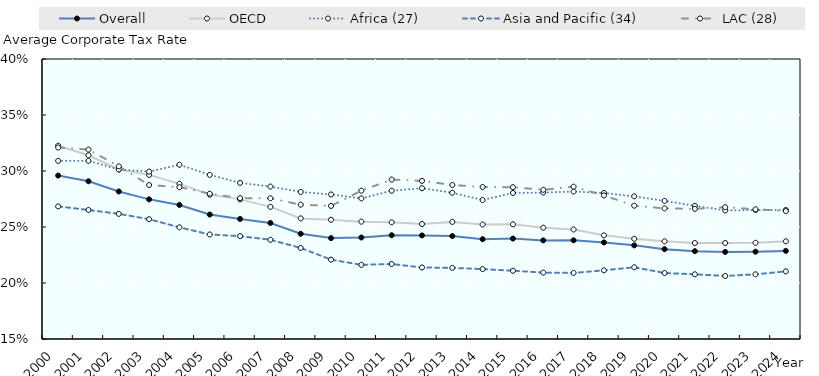
| Category | Overall | OECD | Africa (27) | Asia and Pacific (34) | LAC (28) |
|---|---|---|---|---|---|
| 2000.0 | 0.296 | 0.323 | 0.309 | 0.268 | 0.321 |
| 2001.0 | 0.291 | 0.314 | 0.309 | 0.265 | 0.319 |
| 2002.0 | 0.282 | 0.301 | 0.301 | 0.262 | 0.304 |
| 2003.0 | 0.275 | 0.297 | 0.299 | 0.257 | 0.287 |
| 2004.0 | 0.27 | 0.289 | 0.306 | 0.25 | 0.286 |
| 2005.0 | 0.261 | 0.279 | 0.297 | 0.243 | 0.28 |
| 2006.0 | 0.257 | 0.275 | 0.289 | 0.242 | 0.276 |
| 2007.0 | 0.254 | 0.268 | 0.286 | 0.239 | 0.276 |
| 2008.0 | 0.244 | 0.258 | 0.281 | 0.231 | 0.27 |
| 2009.0 | 0.24 | 0.256 | 0.279 | 0.221 | 0.269 |
| 2010.0 | 0.241 | 0.255 | 0.276 | 0.216 | 0.282 |
| 2011.0 | 0.243 | 0.254 | 0.282 | 0.217 | 0.292 |
| 2012.0 | 0.242 | 0.253 | 0.285 | 0.214 | 0.291 |
| 2013.0 | 0.242 | 0.255 | 0.281 | 0.214 | 0.288 |
| 2014.0 | 0.239 | 0.252 | 0.274 | 0.212 | 0.286 |
| 2015.0 | 0.24 | 0.252 | 0.28 | 0.211 | 0.286 |
| 2016.0 | 0.238 | 0.249 | 0.281 | 0.209 | 0.283 |
| 2017.0 | 0.238 | 0.248 | 0.282 | 0.209 | 0.286 |
| 2018.0 | 0.236 | 0.243 | 0.28 | 0.211 | 0.278 |
| 2019.0 | 0.234 | 0.239 | 0.277 | 0.214 | 0.269 |
| 2020.0 | 0.23 | 0.237 | 0.273 | 0.209 | 0.267 |
| 2021.0 | 0.228 | 0.236 | 0.269 | 0.208 | 0.266 |
| 2022.0 | 0.228 | 0.236 | 0.265 | 0.206 | 0.268 |
| 2023.0 | 0.228 | 0.236 | 0.265 | 0.208 | 0.266 |
| 2024.0 | 0.229 | 0.237 | 0.265 | 0.21 | 0.264 |